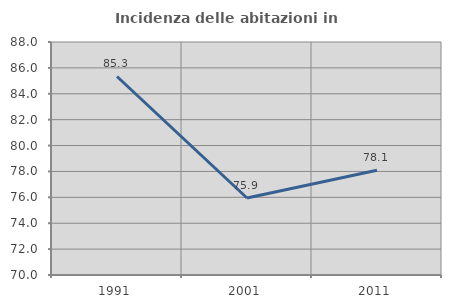
| Category | Incidenza delle abitazioni in proprietà  |
|---|---|
| 1991.0 | 85.336 |
| 2001.0 | 75.949 |
| 2011.0 | 78.087 |